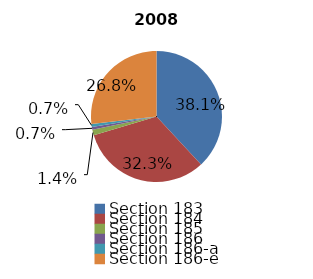
| Category | Series 0 |
|---|---|
| Section 183 | 1286 |
| Section 184 | 1088 |
| Section 185 | 47 |
| Section 186 | 24 |
| Section 186-a | 24 |
| Section 186-e | 905 |